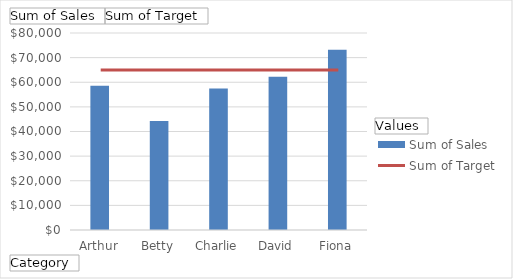
| Category | Sum of Sales |
|---|---|
| Arthur | 58604 |
| Betty | 44215 |
| Charlie | 57490 |
| David | 62268 |
| Fiona | 73173 |